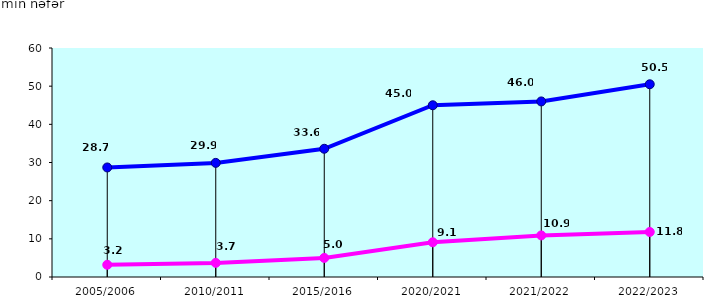
| Category | bakalavriat   bachelor   в бакалавриат   | magistratura   magistry   в магистратуру |
|---|---|---|
| 2005/2006 | 28.7 | 3.2 |
| 2010/2011 | 29.9 | 3.7 |
| 2015/2016 | 33.6 | 5 |
| 2020/2021 | 45 | 9.1 |
| 2021/2022 | 46 | 10.9 |
| 2022/2023 | 50.5 | 11.8 |